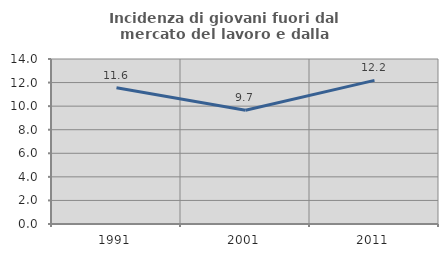
| Category | Incidenza di giovani fuori dal mercato del lavoro e dalla formazione  |
|---|---|
| 1991.0 | 11.568 |
| 2001.0 | 9.65 |
| 2011.0 | 12.189 |